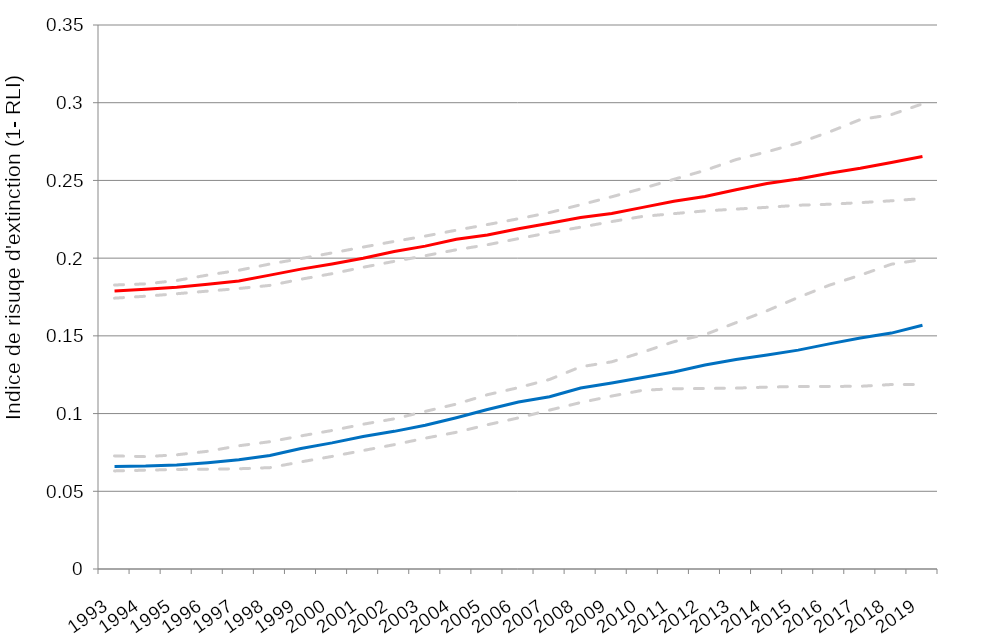
| Category | RLI Monde (seuil bas) | RLI Monde (seuil moyen) | RLI Monde (seuil haut) | RLI France métropolitaine (seuil bas) | RLI France métropolitaine (seuil moyen) | RLI France métropolitaine (seuil haut) |
|---|---|---|---|---|---|---|
| 1993.0 | 0.174 | 0.179 | 0.183 | 0.063 | 0.066 | 0.073 |
| 1994.0 | 0.175 | 0.18 | 0.183 | 0.064 | 0.066 | 0.072 |
| 1995.0 | 0.177 | 0.181 | 0.186 | 0.064 | 0.067 | 0.073 |
| 1996.0 | 0.179 | 0.183 | 0.189 | 0.064 | 0.068 | 0.076 |
| 1997.0 | 0.18 | 0.185 | 0.192 | 0.065 | 0.07 | 0.079 |
| 1998.0 | 0.182 | 0.189 | 0.196 | 0.065 | 0.073 | 0.082 |
| 1999.0 | 0.186 | 0.193 | 0.2 | 0.069 | 0.078 | 0.086 |
| 2000.0 | 0.19 | 0.196 | 0.203 | 0.072 | 0.081 | 0.089 |
| 2001.0 | 0.194 | 0.2 | 0.207 | 0.076 | 0.085 | 0.093 |
| 2002.0 | 0.198 | 0.204 | 0.211 | 0.08 | 0.089 | 0.097 |
| 2003.0 | 0.202 | 0.208 | 0.214 | 0.084 | 0.092 | 0.101 |
| 2004.0 | 0.205 | 0.212 | 0.218 | 0.088 | 0.097 | 0.106 |
| 2005.0 | 0.209 | 0.215 | 0.222 | 0.093 | 0.103 | 0.112 |
| 2006.0 | 0.213 | 0.219 | 0.225 | 0.097 | 0.107 | 0.117 |
| 2007.0 | 0.216 | 0.222 | 0.229 | 0.102 | 0.111 | 0.122 |
| 2008.0 | 0.22 | 0.226 | 0.234 | 0.107 | 0.116 | 0.13 |
| 2009.0 | 0.224 | 0.229 | 0.239 | 0.111 | 0.12 | 0.133 |
| 2010.0 | 0.227 | 0.233 | 0.245 | 0.115 | 0.123 | 0.14 |
| 2011.0 | 0.229 | 0.237 | 0.251 | 0.116 | 0.127 | 0.146 |
| 2012.0 | 0.23 | 0.24 | 0.256 | 0.116 | 0.131 | 0.151 |
| 2013.0 | 0.232 | 0.244 | 0.263 | 0.116 | 0.135 | 0.158 |
| 2014.0 | 0.233 | 0.248 | 0.268 | 0.117 | 0.138 | 0.166 |
| 2015.0 | 0.234 | 0.251 | 0.274 | 0.117 | 0.141 | 0.175 |
| 2016.0 | 0.235 | 0.255 | 0.281 | 0.117 | 0.145 | 0.183 |
| 2017.0 | 0.236 | 0.258 | 0.289 | 0.118 | 0.149 | 0.189 |
| 2018.0 | 0.237 | 0.262 | 0.292 | 0.119 | 0.152 | 0.196 |
| 2019.0 | 0.238 | 0.265 | 0.299 | 0.119 | 0.157 | 0.199 |